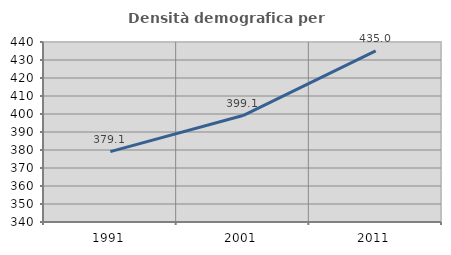
| Category | Densità demografica |
|---|---|
| 1991.0 | 379.068 |
| 2001.0 | 399.131 |
| 2011.0 | 435.016 |